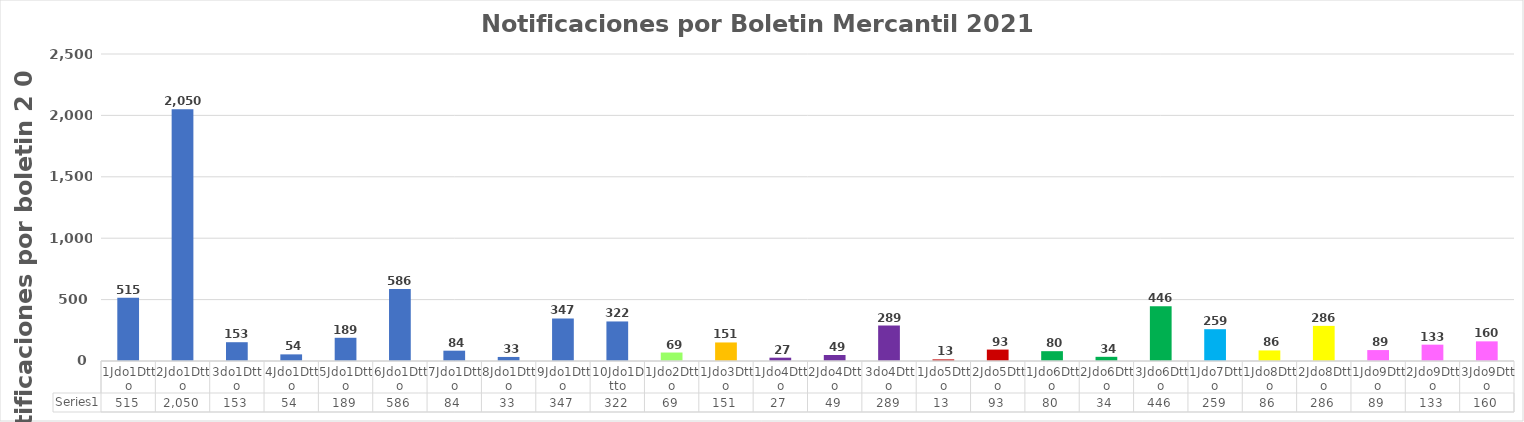
| Category | Series 0 |
|---|---|
| 1Jdo1Dtto | 515 |
| 2Jdo1Dtto | 2050 |
| 3do1Dtto | 153 |
| 4Jdo1Dtto | 54 |
| 5Jdo1Dtto | 189 |
| 6Jdo1Dtto | 586 |
| 7Jdo1Dtto | 84 |
| 8Jdo1Dtto | 33 |
| 9Jdo1Dtto | 347 |
| 10Jdo1Dtto | 322 |
| 1Jdo2Dtto | 69 |
| 1Jdo3Dtto | 151 |
| 1Jdo4Dtto | 27 |
| 2Jdo4Dtto | 49 |
| 3do4Dtto | 289 |
| 1Jdo5Dtto | 13 |
| 2Jdo5Dtto | 93 |
| 1Jdo6Dtto | 80 |
| 2Jdo6Dtto | 34 |
| 3Jdo6Dtto | 446 |
| 1Jdo7Dtto | 259 |
| 1Jdo8Dtto | 86 |
| 2Jdo8Dtto | 286 |
| 1Jdo9Dtto | 89 |
| 2Jdo9Dtto | 133 |
| 3Jdo9Dtto | 160 |